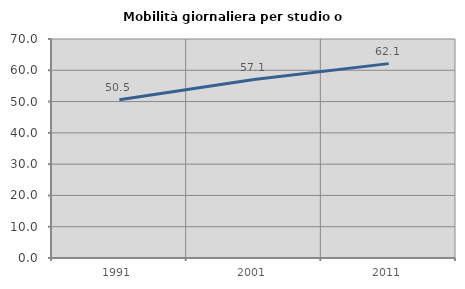
| Category | Mobilità giornaliera per studio o lavoro |
|---|---|
| 1991.0 | 50.548 |
| 2001.0 | 57.05 |
| 2011.0 | 62.126 |